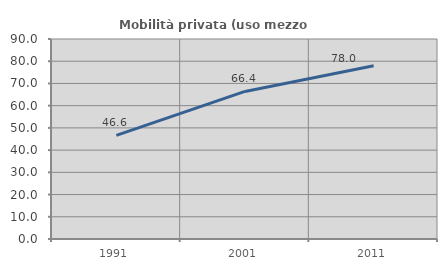
| Category | Mobilità privata (uso mezzo privato) |
|---|---|
| 1991.0 | 46.604 |
| 2001.0 | 66.404 |
| 2011.0 | 77.979 |